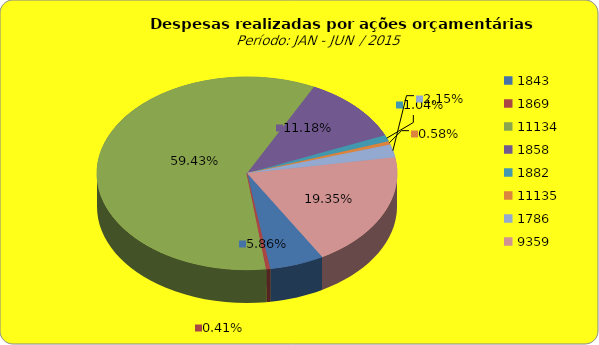
| Category | Series 1 |
|---|---|
| 1843.0 | 6734894.56 |
| 1869.0 | 468023.66 |
| 11134.0 | 68322818.94 |
| 1858.0 | 12855188.48 |
| 1882.0 | 1197529.41 |
| 11135.0 | 670863.49 |
| 1786.0 | 2473035.55 |
| 9359.0 | 22245608.63 |